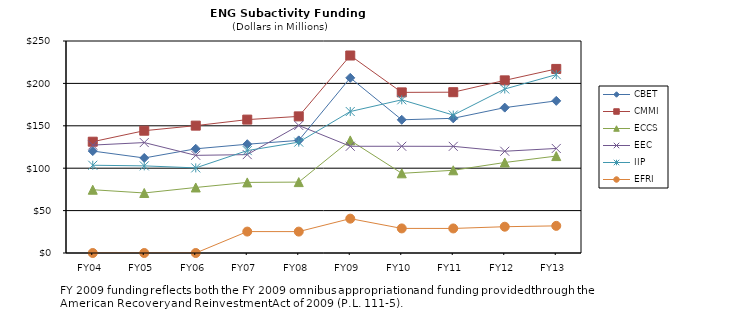
| Category | CBET | CMMI | ECCS | EEC | IIP | EFRI |
|---|---|---|---|---|---|---|
| FY04 | 120.21 | 131.24 | 74.61 | 127.26 | 103.48 | 0 |
| FY05 | 112.06 | 144.23 | 70.79 | 130.23 | 102.75 | 0 |
| FY06 | 122.87 | 150.19 | 77.27 | 115.16 | 100.36 | 0 |
| FY07 | 128.27 | 157.3 | 83.24 | 116.02 | 120.78 | 25.25 |
| FY08 | 132.81 | 161.11 | 83.6 | 150.41 | 130.72 | 25.23 |
| FY09 | 206.57 | 232.89 | 132.78 | 125.86 | 166.82 | 40.5 |
| FY10 | 157.08 | 189.4 | 93.97 | 125.86 | 180.63 | 28.99 |
| FY11 | 158.82 | 189.62 | 97.54 | 125.76 | 162.65 | 28.95 |
| FY12 | 171.45 | 203.58 | 106.73 | 120 | 193.41 | 31 |
| FY13 | 179.4 | 217.06 | 114.3 | 123.27 | 210.3 | 32 |